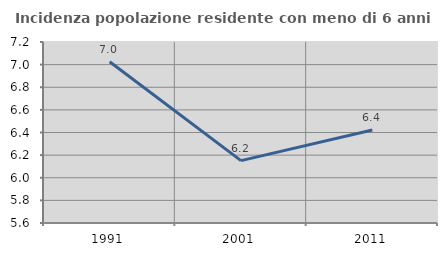
| Category | Incidenza popolazione residente con meno di 6 anni |
|---|---|
| 1991.0 | 7.025 |
| 2001.0 | 6.152 |
| 2011.0 | 6.422 |